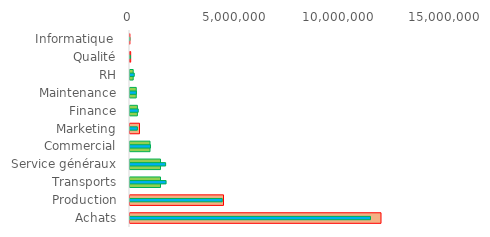
| Category | Vert | Rouge |
|---|---|---|
| Achats | 0 | 12000000 |
| Production | 0 | 4500000 |
| Transports | 1500000 | 0 |
| Service généraux | 1500000 | 0 |
| Commercial | 1000000 | 0 |
| Marketing | 0 | 500000 |
| Finance | 400000 | 0 |
| Maintenance | 345000 | 0 |
| RH | 200000 | 0 |
| Qualité | 0 | 80000 |
| Informatique  | 0 | 43000 |